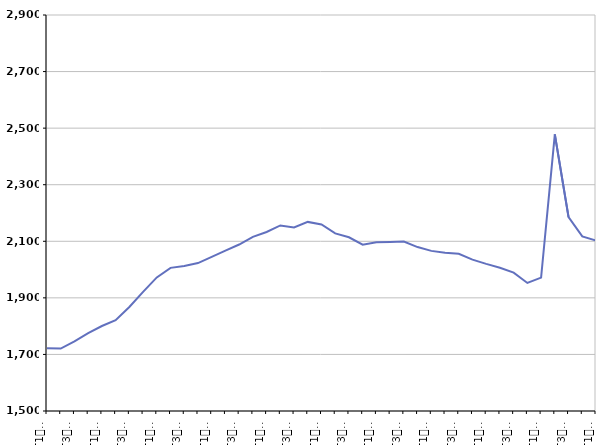
| Category | De 25 à 49 ans |
|---|---|
| T1
2011 | 1722.1 |
| T2
2011 | 1720.8 |
| T3
2011 | 1746.5 |
| T4
2011 | 1775.3 |
| T1
2012 | 1800.4 |
| T2
2012 | 1820.8 |
| T3
2012 | 1867.9 |
| T4
2012 | 1921.1 |
| T1
2013 | 1972.3 |
| T2
2013 | 2006.1 |
| T3
2013 | 2012.4 |
| T4
2013 | 2022.9 |
| T1
2014 | 2044.7 |
| T2
2014 | 2067.2 |
| T3
2014 | 2088.5 |
| T4
2014 | 2115.8 |
| T1
2015 | 2133 |
| T2
2015 | 2156 |
| T3
2015 | 2148.7 |
| T4
2015 | 2168.5 |
| T1
2016 | 2159.6 |
| T2
2016 | 2128 |
| T3
2016 | 2114.1 |
| T4
2016 | 2088.1 |
| T1
2017 | 2096.9 |
| T2
2017 | 2097.9 |
| T3
2017 | 2099.2 |
| T4
2017 | 2079.5 |
| T1
2018 | 2066.1 |
| T2
2018 | 2059.3 |
| T3
2018 | 2055.7 |
| T4
2018 | 2035.2 |
| T1
2019 | 2020.1 |
| T2
2019 | 2006.6 |
| T3
2019 | 1989.3 |
| T4
2019 | 1952.6 |
| T1
2020 | 1971.6 |
| T2
2020 | 2478 |
| T3
2020 | 2185.2 |
| T4
2020 | 2117.2 |
| T1
2021 | 2102.8 |